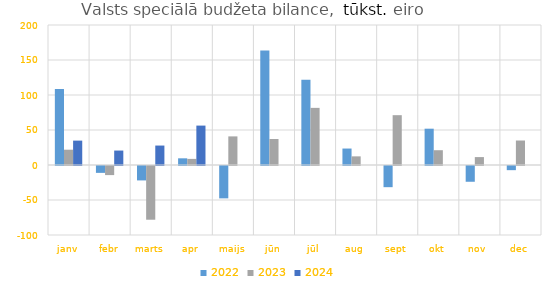
| Category | 2022 | 2023 | 2024 |
|---|---|---|---|
| janv | 108554.179 | 21850.373 | 34837.439 |
| febr | -9818.538 | -12989.478 | 20635.979 |
| marts | -20590.078 | -76739.856 | 27777.341 |
| apr | 9551.101 | 8730.038 | 56293.547 |
| maijs | -46228.723 | 40875.463 | 0 |
| jūn | 163534.283 | 37142.428 | 0 |
| jūl | 121861.127 | 81614.598 | 0 |
| aug | 23515.069 | 12345.427 | 0 |
| sept | -30249.526 | 71171.512 | 0 |
| okt | 51869.404 | 21120.694 | 0 |
| nov | -22523.369 | 11303.868 | 0 |
| dec | -5948.69 | 34987.715 | 0 |